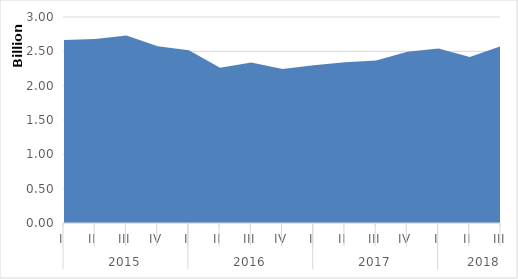
| Category | Series 0 |
|---|---|
| 0 | 2665666469.899 |
| 1 | 2679849656.076 |
| 2 | 2731065466.38 |
| 3 | 2574200644.85 |
| 4 | 2515893725.555 |
| 5 | 2262431630.392 |
| 6 | 2337566235.914 |
| 7 | 2241394870.23 |
| 8 | 2297969932.667 |
| 9 | 2341718574.424 |
| 10 | 2365775963.414 |
| 11 | 2494740654.722 |
| 12 | 2540493599.594 |
| 13 | 2418862564.457 |
| 14 | 2576126523.263 |